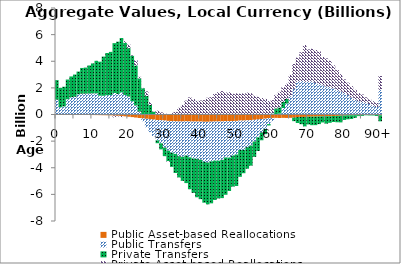
| Category | Public Asset-based Reallocations | Public Transfers | Private Transfers | Private Asset-based Reallocations |
|---|---|---|---|---|
| 0 | -28.464 | 1112.428 | 1468.168 | 0.067 |
|  | -28.445 | 548.874 | 1455.327 | 0.065 |
| 2 | -29.093 | 608.223 | 1477.263 | 0.065 |
| 3 | -29.413 | 1148.177 | 1478.345 | 0.062 |
| 4 | -29.834 | 1298.787 | 1560.04 | -0.06 |
| 5 | -31.411 | 1331.091 | 1670.113 | -0.066 |
| 6 | -32.855 | 1514.888 | 1708.879 | -0.009 |
| 7 | -35.005 | 1562.813 | 1933.777 | -0.122 |
| 8 | -37.003 | 1565.935 | 1958.003 | -0.008 |
| 9 | -39.667 | 1573.481 | 2109.521 | -0.005 |
| 10 | -42.138 | 1588.092 | 2248.685 | -0.026 |
| 11 | -45.221 | 1588.293 | 2445.696 | -0.091 |
| 12 | -48.731 | 1413.158 | 2553.392 | -0.013 |
| 13 | -53.652 | 1407.939 | 2942.944 | -0.119 |
| 14 | -57.969 | 1450.804 | 3168.73 | -0.131 |
| 15 | -64.15 | 1464.359 | 3239.059 | 0.083 |
| 16 | -81.967 | 1616.55 | 3743.02 | -138.844 |
| 17 | -95.029 | 1544.097 | 3925.112 | -51.056 |
| 18 | -109.429 | 1662.726 | 4084.561 | -86.5 |
| 19 | -139.893 | 1464.58 | 3925.433 | 123.022 |
| 20 | -167.658 | 1352.253 | 3634.122 | 274.905 |
| 21 | -196.954 | 996.606 | 3418.716 | 46.72 |
| 22 | -228.679 | 674.474 | 3008.633 | 387.125 |
| 23 | -263.045 | 213.765 | 2500.841 | 116.102 |
| 24 | -295.512 | -212.19 | 1972.641 | 25.093 |
| 25 | -324.404 | -635.555 | 1396.049 | 343.228 |
| 26 | -359.612 | -960.92 | 721.509 | 212.449 |
| 27 | -386.588 | -1255.725 | 212.818 | 31.823 |
| 28 | -412.55 | -1531.786 | -212.396 | 291.252 |
| 29 | -431.483 | -1733.088 | -456.368 | 165.788 |
| 30 | -455.659 | -2023.238 | -650.058 | 89.858 |
| 31 | -480.752 | -2232.9 | -792.169 | -58.169 |
| 32 | -497.594 | -2368.594 | -1064.645 | 105.607 |
| 33 | -507.146 | -2452.563 | -1435.774 | 200.766 |
| 34 | -524.607 | -2606.656 | -1596.556 | 505.177 |
| 35 | -523.218 | -2654.534 | -1807.9 | 718.3 |
| 36 | -512.389 | -2576.468 | -2063.323 | 1044.504 |
| 37 | -522.843 | -2692.993 | -2397.363 | 1284.716 |
| 38 | -529.588 | -2775.415 | -2583.326 | 1157.467 |
| 39 | -529.246 | -2799.463 | -2889.244 | 1023.369 |
| 40 | -532.517 | -2864.718 | -2963.581 | 1054.338 |
| 41 | -547.027 | -3011.03 | -3066.349 | 1080.338 |
| 42 | -547.459 | -3054.26 | -3149.164 | 1257.132 |
| 43 | -535.187 | -2985.29 | -3153.221 | 1300.773 |
| 44 | -525.617 | -2938.205 | -2959.655 | 1549.524 |
| 45 | -522.471 | -2943.159 | -2841.544 | 1673.841 |
| 46 | -518.651 | -2885.635 | -2875.134 | 1756.043 |
| 47 | -497.739 | -2730.477 | -2802.119 | 1653.909 |
| 48 | -500.302 | -2740.906 | -2504.552 | 1672.902 |
| 49 | -487.584 | -2603.15 | -2327.08 | 1554.393 |
| 50 | -481.422 | -2522.496 | -2368.253 | 1591.061 |
| 51 | -454.895 | -2205.597 | -2021.863 | 1564.007 |
| 52 | -457.167 | -2198.768 | -1755.517 | 1582.485 |
| 53 | -440.998 | -2011.668 | -1618.977 | 1645.425 |
| 54 | -430.719 | -1901.178 | -1513.011 | 1597.1 |
| 55 | -399.323 | -1627.966 | -1154.604 | 1423.226 |
| 56 | -373.502 | -1338.751 | -1030.393 | 1329.423 |
| 57 | -335.187 | -1010.894 | -589.623 | 1239.498 |
| 58 | -312.585 | -770.361 | -393.656 | 1171.101 |
| 59 | -273.875 | -443.839 | -105.925 | 1010.374 |
| 60 | -257.405 | -246.805 | 76.508 | 1007.23 |
| 61 | -252.917 | 29.398 | 432.176 | 1012.963 |
| 62 | -264.672 | 71.375 | 461.292 | 1166.584 |
| 63 | -251.452 | 488.202 | 467.735 | 1102.783 |
| 64 | -259.185 | 822.012 | 351.464 | 1140.915 |
| 65 | -248.64 | 1374.766 | -3.481 | 1597.91 |
| 66 | -230.878 | 1931.068 | -268.676 | 1862.8 |
| 67 | -195.393 | 2452.391 | -444.454 | 1822.319 |
| 68 | -182.854 | 2515.683 | -546.481 | 2161.362 |
| 69 | -179.239 | 2459.12 | -714.16 | 2760.953 |
| 70 | -166.39 | 2465.875 | -579.372 | 2423.351 |
| 71 | -160.37 | 2483.776 | -642.598 | 2455.13 |
| 72 | -155.671 | 2378.048 | -643.62 | 2469.559 |
| 73 | -146.654 | 2283.805 | -575.076 | 2450.784 |
| 74 | -136.543 | 2199.329 | -461.045 | 2121.279 |
| 75 | -131.736 | 2101.509 | -555.893 | 2113.334 |
| 76 | -129.41 | 2061.416 | -495.567 | 1981.124 |
| 77 | -114.6 | 1972.193 | -450.984 | 1720.211 |
| 78 | -102.797 | 1834.842 | -481.211 | 1504.364 |
| 79 | -85.756 | 1722.979 | -508.259 | 1310.251 |
| 80 | -74.647 | 1612.606 | -335.262 | 1025.766 |
| 81 | -60.396 | 1480.107 | -300.072 | 911.951 |
| 82 | -58.329 | 1276.051 | -276.472 | 851.524 |
| 83 | -52.783 | 1131.594 | -199.575 | 724.06 |
| 84 | -49.5 | 996.826 | -69.71 | 603.827 |
| 85 | -44.036 | 934.477 | -65.538 | 567.723 |
| 86 | -37.358 | 878.578 | -21.975 | 412.015 |
| 87 | -29.158 | 791.441 | -42.194 | 351.384 |
| 88 | -25.149 | 673.283 | -45.806 | 320.717 |
| 89 | -20.033 | 569.475 | -89.781 | 296.265 |
| 90+ | -60.927 | 1852.626 | -451.97 | 1037.275 |